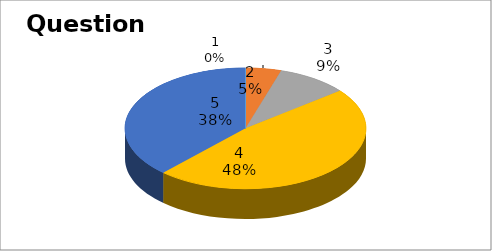
| Category | Series 0 |
|---|---|
| 0 | 0 |
| 1 | 1 |
| 2 | 2 |
| 3 | 10 |
| 4 | 8 |